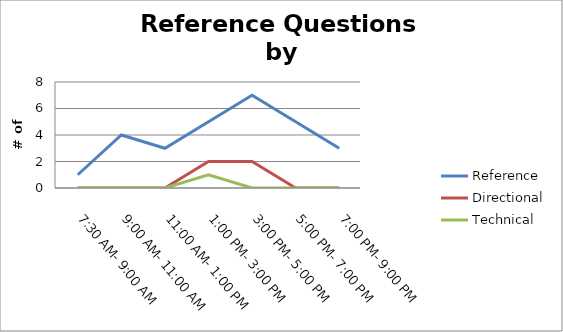
| Category | Reference | Directional | Technical |
|---|---|---|---|
| 7:30 AM- 9:00 AM | 1 | 0 | 0 |
| 9:00 AM- 11:00 AM | 4 | 0 | 0 |
| 11:00 AM- 1:00 PM | 3 | 0 | 0 |
| 1:00 PM- 3:00 PM | 5 | 2 | 1 |
| 3:00 PM- 5:00 PM | 7 | 2 | 0 |
| 5:00 PM- 7:00 PM | 5 | 0 | 0 |
| 7:00 PM- 9:00 PM | 3 | 0 | 0 |